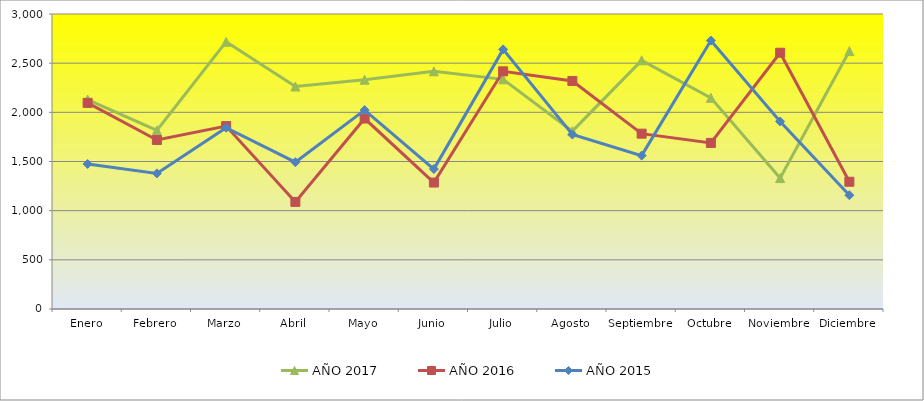
| Category | AÑO 2017 | AÑO 2016 | AÑO 2015 |
|---|---|---|---|
| Enero | 2130 | 2096 | 1475 |
| Febrero | 1817.143 | 1719 | 1379 |
| Marzo | 2717.143 | 1860 | 1844 |
| Abril | 2262.857 | 1089 | 1493 |
| Mayo | 2331.429 | 1937 | 2023 |
| Junio | 2417.143 | 1286 | 1423 |
| Julio | 2335.714 | 2417 | 2640 |
| Agosto | 1808.571 | 2319 | 1774 |
| Septiembre | 2528.571 | 1783 | 1560 |
| Octubre | 2147.442 | 1689 | 2730 |
| Noviembre | 1331.163 | 2606 | 1907 |
| Diciembre | 2622.857 | 1294 | 1157 |